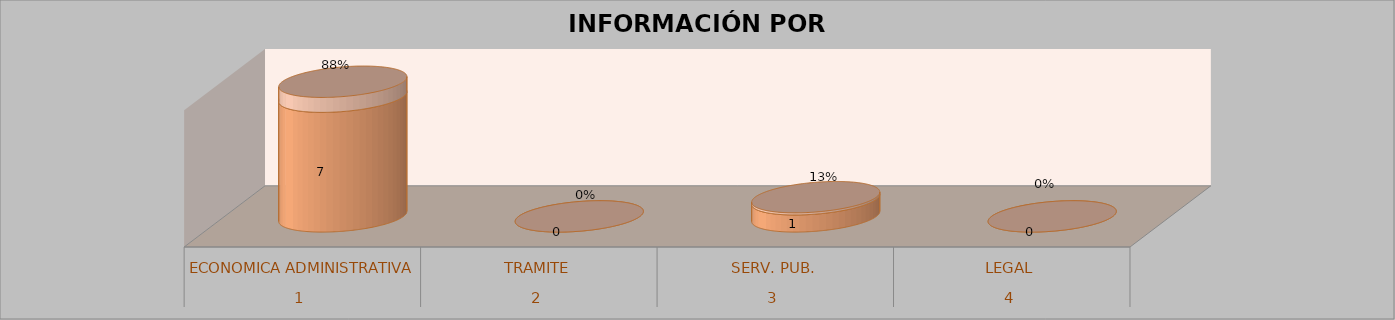
| Category | Series 0 | Series 1 | Series 2 | Series 3 |
|---|---|---|---|---|
| 0 |  |  | 7 | 0.875 |
| 1 |  |  | 0 | 0 |
| 2 |  |  | 1 | 0.125 |
| 3 |  |  | 0 | 0 |